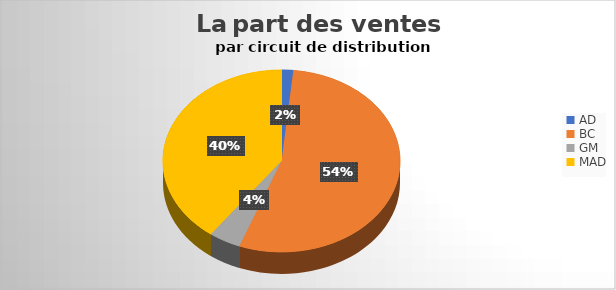
| Category | Series 0 |
|---|---|
| AD | 0.016 |
| BC | 0.542 |
| GM | 0.044 |
| MAD | 0.399 |